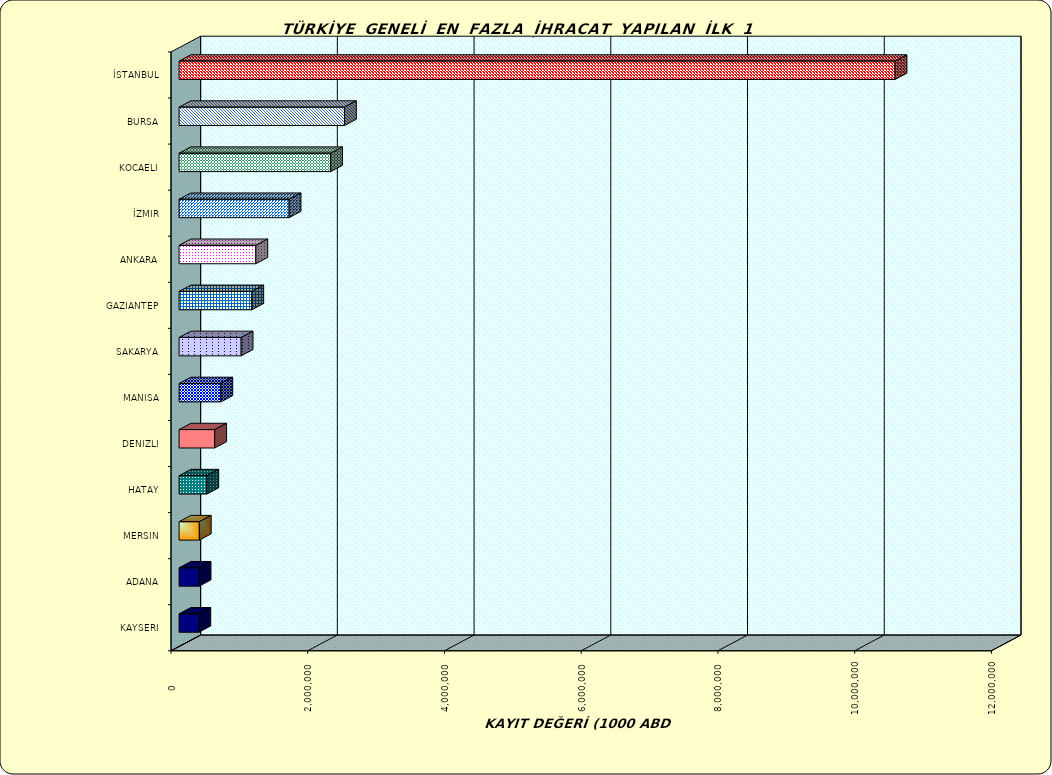
| Category | Series 0 |
|---|---|
| İSTANBUL | 10472973.753 |
| BURSA | 2419791.127 |
| KOCAELI | 2217493.358 |
| İZMIR | 1609858.521 |
| ANKARA | 1122950.265 |
| GAZIANTEP | 1064082.877 |
| SAKARYA | 907982.467 |
| MANISA | 611058.853 |
| DENIZLI | 521331.897 |
| HATAY | 406371.356 |
| MERSIN | 296399.917 |
| ADANA | 293025.552 |
| KAYSERI | 289616.169 |